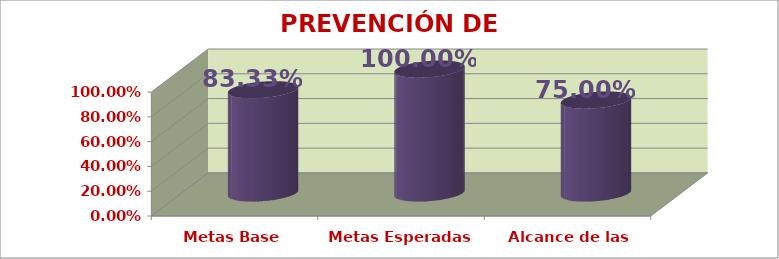
| Category | PREVENCIÓN DE RIESGOS |
|---|---|
| Metas Base | 0.833 |
| Metas Esperadas | 1 |
| Alcance de las Metas | 0.75 |